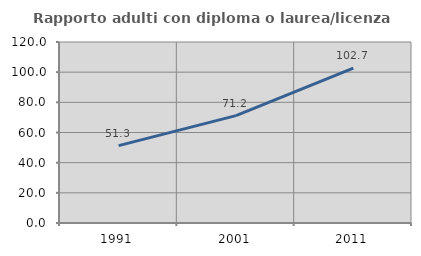
| Category | Rapporto adulti con diploma o laurea/licenza media  |
|---|---|
| 1991.0 | 51.282 |
| 2001.0 | 71.182 |
| 2011.0 | 102.73 |